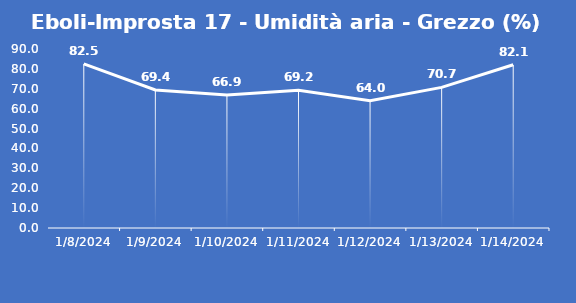
| Category | Eboli-Improsta 17 - Umidità aria - Grezzo (%) |
|---|---|
| 1/8/24 | 82.5 |
| 1/9/24 | 69.4 |
| 1/10/24 | 66.9 |
| 1/11/24 | 69.2 |
| 1/12/24 | 64 |
| 1/13/24 | 70.7 |
| 1/14/24 | 82.1 |